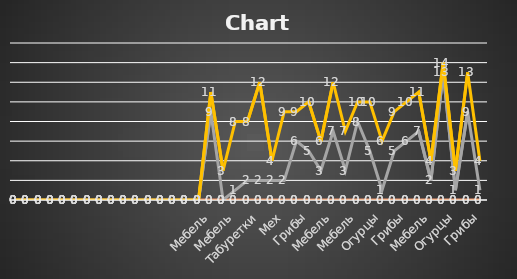
| Category | Series 0 | Series 1 | Series 2 | Series 3 |
|---|---|---|---|---|
| Грибы | 0 | 0 | 1 | 4 |
| Мёд | 0 | 0 | 9 | 13 |
| Огурцы | 0 | 0 | 1 | 3 |
| Табуретки | 0 | 0 | 13 | 14 |
| Мебель | 0 | 0 | 2 | 4 |
| Телевизор | 0 | 0 | 7 | 11 |
| Грибы | 0 | 0 | 6 | 10 |
| Мех | 0 | 0 | 5 | 9 |
| Огурцы | 0 | 0 | 1 | 6 |
| Табуретки | 0 | 0 | 5 | 10 |
| Мебель | 0 | 0 | 8 | 10 |
| Табуретки | 0 | 0 | 3 | 7 |
| Мебель | 0 | 0 | 7 | 12 |
| Телевизор | 0 | 0 | 3 | 6 |
| Грибы | 0 | 0 | 5 | 10 |
| Мёд | 0 | 0 | 6 | 9 |
| Мех | 0 | 0 | 2 | 9 |
| Мебель | 0 | 0 | 2 | 4 |
| Табуретки | 0 | 0 | 2 | 12 |
| Мебель | 0 | 0 | 2 | 8 |
| Мебель | 0 | 0 | 1 | 8 |
| Табуретки | 0 | 0 | 0 | 3 |
| Мебель | 0 | 0 | 9 | 11 |